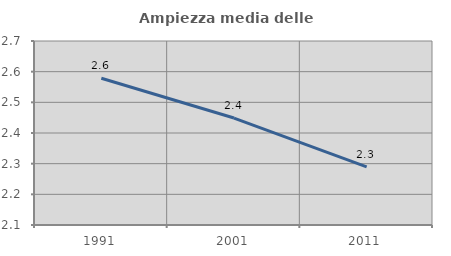
| Category | Ampiezza media delle famiglie |
|---|---|
| 1991.0 | 2.578 |
| 2001.0 | 2.449 |
| 2011.0 | 2.289 |